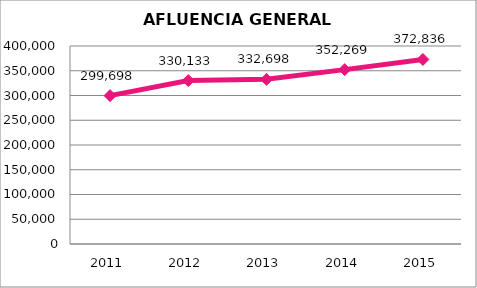
| Category | Series 0 |
|---|---|
| 2011.0 | 299698 |
| 2012.0 | 330133 |
| 2013.0 | 332698 |
| 2014.0 | 352269 |
| 2015.0 | 372836 |